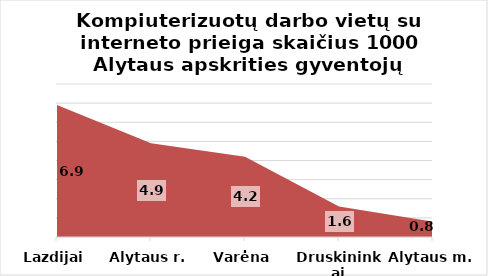
| Category | Series 0 |
|---|---|
| Lazdijai | 6.9 |
| Alytaus r. | 4.9 |
| Varėna | 4.2 |
| Druskininkai | 1.6 |
| Alytaus m. | 0.8 |